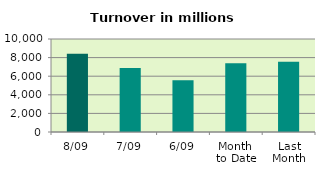
| Category | Series 0 |
|---|---|
| 8/09 | 8410.655 |
| 7/09 | 6893.339 |
| 6/09 | 5556.871 |
| Month 
to Date | 7405.067 |
| Last
Month | 7565.704 |